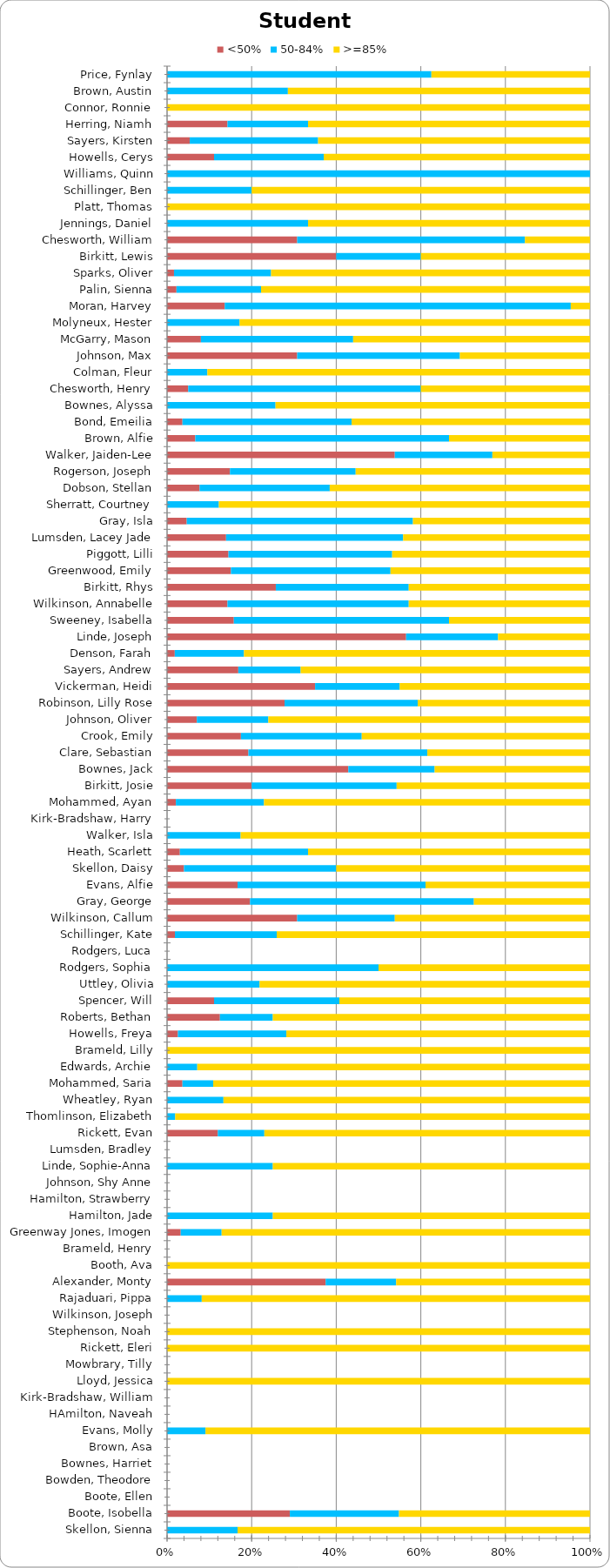
| Category | <50% | 50-84% | >=85% |
|---|---|---|---|
| Skellon, Sienna | 0 | 5 | 25 |
| Boote, Isobella | 9 | 8 | 14 |
| Boote, Ellen | 0 | 0 | 0 |
| Bowden, Theodore | 0 | 0 | 0 |
| Bownes, Harriet | 0 | 0 | 0 |
| Brown, Asa | 0 | 0 | 0 |
| Evans, Molly | 0 | 1 | 10 |
| HAmilton, Naveah | 0 | 0 | 0 |
| Kirk-Bradshaw, William | 0 | 0 | 0 |
| Lloyd, Jessica | 0 | 0 | 1 |
| Mowbrary, Tilly | 0 | 0 | 0 |
| Rickett, Eleri | 0 | 0 | 57 |
| Stephenson, Noah | 0 | 0 | 6 |
| Wilkinson, Joseph | 0 | 0 | 0 |
| Rajaduari, Pippa | 0 | 5 | 56 |
| Alexander, Monty | 9 | 4 | 11 |
| Booth, Ava | 0 | 0 | 7 |
| Brameld, Henry | 0 | 0 | 0 |
| Greenway Jones, Imogen | 1 | 3 | 27 |
| Hamilton, Jade | 0 | 1 | 3 |
| Hamilton, Strawberry | 0 | 0 | 0 |
| Johnson, Shy Anne | 0 | 0 | 0 |
| Linde, Sophie-Anna | 0 | 1 | 3 |
| Lumsden, Bradley | 0 | 0 | 0 |
| Rickett, Evan | 12 | 11 | 77 |
| Thomlinson, Elizabeth | 0 | 1 | 51 |
| Wheatley, Ryan | 0 | 10 | 65 |
| Mohammed, Saria | 2 | 4 | 49 |
| Edwards, Archie | 0 | 1 | 13 |
| Brameld, Lilly | 0 | 0 | 1 |
| Howells, Freya | 1 | 10 | 28 |
| Roberts, Bethan | 1 | 1 | 6 |
| Spencer, Will | 3 | 8 | 16 |
| Uttley, Olivia | 0 | 7 | 25 |
| Rodgers, Sophia | 0 | 3 | 3 |
| Rodgers, Luca | 0 | 0 | 0 |
| Schillinger, Kate | 1 | 13 | 40 |
| Wilkinson, Callum | 4 | 3 | 6 |
| Gray, George | 10 | 27 | 14 |
| Evans, Alfie | 3 | 8 | 7 |
| Skellon, Daisy | 1 | 9 | 15 |
| Heath, Scarlett | 1 | 10 | 22 |
| Walker, Isla | 0 | 4 | 19 |
| Kirk-Bradshaw, Harry | 0 | 0 | 0 |
| Mohammed, Ayan | 1 | 10 | 37 |
| Birkitt, Josie | 7 | 12 | 16 |
| Bownes, Jack | 21 | 10 | 18 |
| Clare, Sebastian | 10 | 22 | 20 |
| Crook, Emily | 11 | 18 | 34 |
| Johnson, Oliver | 5 | 12 | 54 |
| Robinson, Lilly Rose | 15 | 17 | 22 |
| Vickerman, Heidi | 7 | 4 | 9 |
| Sayers, Andrew | 16 | 14 | 65 |
| Denson, Farah | 1 | 9 | 45 |
| Linde, Joseph | 13 | 5 | 5 |
| Sweeney, Isabella | 9 | 29 | 19 |
| Wilkinson, Annabelle | 5 | 15 | 15 |
| Birkitt, Rhys | 9 | 11 | 15 |
| Greenwood, Emily | 8 | 20 | 25 |
| Piggott, Lilli | 9 | 24 | 29 |
| Lumsden, Lacey Jade | 6 | 18 | 19 |
| Gray, Isla | 2 | 23 | 18 |
| Sherratt, Courtney | 0 | 12 | 86 |
| Dobson, Stellan | 1 | 4 | 8 |
| Rogerson, Joseph | 11 | 22 | 41 |
| Walker, Jaiden-Lee | 14 | 6 | 6 |
| Brown, Alfie | 1 | 9 | 5 |
| Bond, Emeilia | 2 | 22 | 31 |
| Bownes, Alyssa | 0 | 10 | 29 |
| Chesworth, Henry | 1 | 11 | 8 |
| Colman, Fleur | 0 | 4 | 38 |
| Johnson, Max | 4 | 5 | 4 |
| McGarry, Mason | 2 | 9 | 14 |
| Molyneux, Hester | 0 | 6 | 29 |
| Moran, Harvey | 3 | 18 | 1 |
| Palin, Sienna | 1 | 9 | 35 |
| Sparks, Oliver | 1 | 14 | 46 |
| Birkitt, Lewis | 2 | 1 | 2 |
| Chesworth, William | 4 | 7 | 2 |
| Jennings, Daniel | 0 | 1 | 2 |
| Platt, Thomas | 0 | 0 | 2 |
| Schillinger, Ben | 0 | 1 | 4 |
| Williams, Quinn | 0 | 4 | 0 |
| Howells, Cerys | 3 | 7 | 17 |
| Sayers, Kirsten | 3 | 17 | 36 |
| Herring, Niamh | 3 | 4 | 14 |
| Connor, Ronnie | 0 | 0 | 3 |
| Brown, Austin | 0 | 2 | 5 |
| Price, Fynlay | 0 | 5 | 3 |